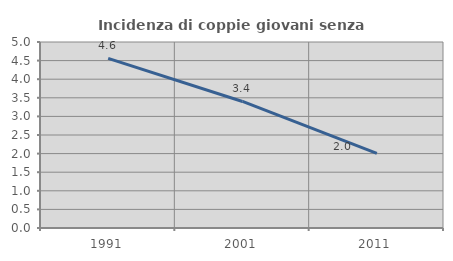
| Category | Incidenza di coppie giovani senza figli |
|---|---|
| 1991.0 | 4.561 |
| 2001.0 | 3.401 |
| 2011.0 | 2.007 |